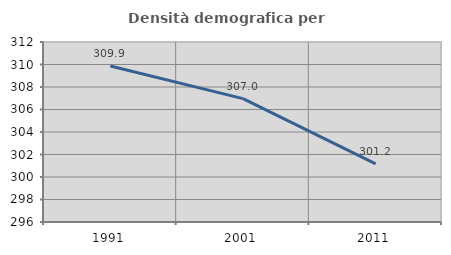
| Category | Densità demografica |
|---|---|
| 1991.0 | 309.864 |
| 2001.0 | 306.967 |
| 2011.0 | 301.172 |